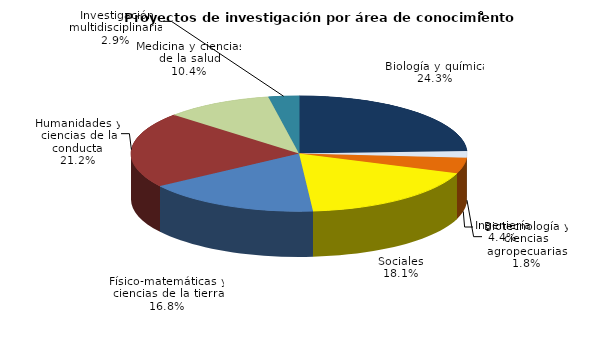
| Category | Series 0 |
|---|---|
| Biología y química | 0.243 |
| Biotecnología y ciencias agropecuarias | 0.018 |
| Ingeniería | 0.044 |
| Sociales | 0.181 |
| Físico-matemáticas y ciencias de la tierra | 0.168 |
| Humanidades y ciencias de la conducta | 0.212 |
| Medicina y ciencias de la salud | 0.104 |
| Investigación multidisciplinaria | 0.029 |